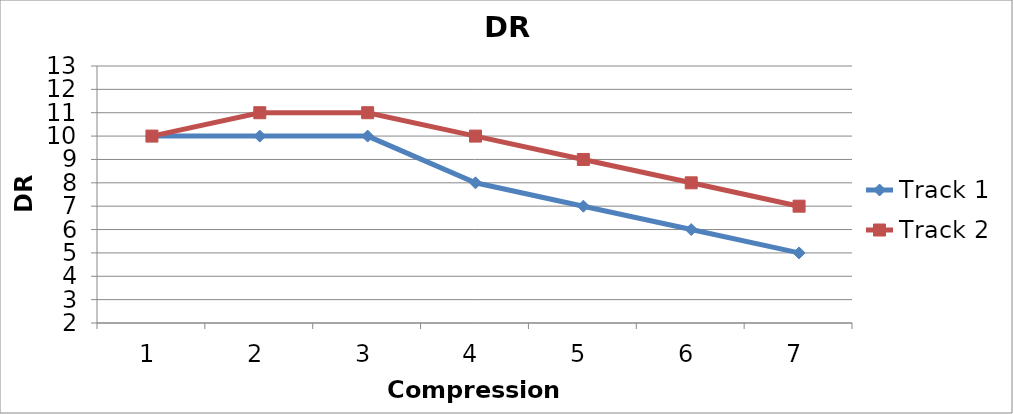
| Category | Track 1 | Track 2 |
|---|---|---|
| 0 | 10 | 10 |
| 1 | 10 | 11 |
| 2 | 10 | 11 |
| 3 | 8 | 10 |
| 4 | 7 | 9 |
| 5 | 6 | 8 |
| 6 | 5 | 7 |